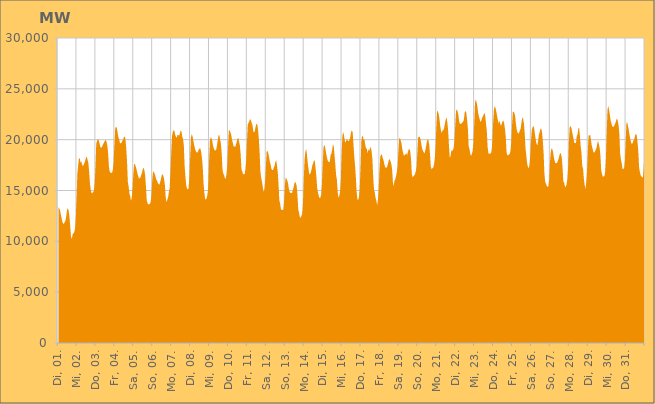
| Category | Series 0 |
|---|---|
|  Di, 01.  | 13354.942 |
|  Di, 01.  | 13255.334 |
|  Di, 01.  | 13085.168 |
|  Di, 01.  | 12667.159 |
|  Di, 01.  | 12308.351 |
|  Di, 01.  | 11910.334 |
|  Di, 01.  | 11761.243 |
|  Di, 01.  | 11702.961 |
|  Di, 01.  | 11907.739 |
|  Di, 01.  | 12050.575 |
|  Di, 01.  | 12500.394 |
|  Di, 01.  | 13094.295 |
|  Di, 01.  | 13257.323 |
|  Di, 01.  | 12997.577 |
|  Di, 01.  | 12395.051 |
|  Di, 01.  | 11457.394 |
|  Di, 01.  | 10455.026 |
|  Mi, 02.  | 10236.209 |
|  Mi, 02.  | 10668.967 |
|  Mi, 02.  | 10793.379 |
|  Mi, 02.  | 10877.033 |
|  Mi, 02.  | 11205.468 |
|  Mi, 02.  | 12221.2 |
|  Mi, 02.  | 14253.517 |
|  Mi, 02.  | 16600.066 |
|  Mi, 02.  | 17453.735 |
|  Mi, 02.  | 18122.37 |
|  Mi, 02.  | 18207.634 |
|  Mi, 02.  | 17735.587 |
|  Mi, 02.  | 17884.287 |
|  Mi, 02.  | 17563.233 |
|  Mi, 02.  | 17381.951 |
|  Mi, 02.  | 17521.274 |
|  Mi, 02.  | 17725.417 |
|  Mi, 02.  | 17936.06 |
|  Mi, 02.  | 18224.219 |
|  Mi, 02.  | 18333.295 |
|  Mi, 02.  | 18009.559 |
|  Mi, 02.  | 17681.701 |
|  Mi, 02.  | 16836.066 |
|  Mi, 02.  | 15659.605 |
|  Do, 03.  | 15081.889 |
|  Do, 03.  | 14766.886 |
|  Do, 03.  | 14720.924 |
|  Do, 03.  | 14861.775 |
|  Do, 03.  | 14964.348 |
|  Do, 03.  | 15733.579 |
|  Do, 03.  | 17422.314 |
|  Do, 03.  | 19612.31 |
|  Do, 03.  | 19873.034 |
|  Do, 03.  | 20060.047 |
|  Do, 03.  | 19966.723 |
|  Do, 03.  | 19661.201 |
|  Do, 03.  | 19327.11 |
|  Do, 03.  | 19196.018 |
|  Do, 03.  | 19262.035 |
|  Do, 03.  | 19435.202 |
|  Do, 03.  | 19585.532 |
|  Do, 03.  | 19746.894 |
|  Do, 03.  | 19927.138 |
|  Do, 03.  | 19953.826 |
|  Do, 03.  | 19810.943 |
|  Do, 03.  | 19414.29 |
|  Do, 03.  | 18715.01 |
|  Do, 03.  | 17374.387 |
|  Fr, 04.  | 16858.722 |
|  Fr, 04.  | 16770.253 |
|  Fr, 04.  | 16714.187 |
|  Fr, 04.  | 16743.367 |
|  Fr, 04.  | 17016.13 |
|  Fr, 04.  | 17798.197 |
|  Fr, 04.  | 19515.265 |
|  Fr, 04.  | 21102.726 |
|  Fr, 04.  | 21282.251 |
|  Fr, 04.  | 21173.187 |
|  Fr, 04.  | 20714.526 |
|  Fr, 04.  | 20246.556 |
|  Fr, 04.  | 20049.71 |
|  Fr, 04.  | 19676.047 |
|  Fr, 04.  | 19646.544 |
|  Fr, 04.  | 19702.779 |
|  Fr, 04.  | 19877.732 |
|  Fr, 04.  | 19986.54 |
|  Fr, 04.  | 20266.79 |
|  Fr, 04.  | 20317.382 |
|  Fr, 04.  | 20059.669 |
|  Fr, 04.  | 19179.881 |
|  Fr, 04.  | 17845.682 |
|  Fr, 04.  | 15863.469 |
|  Sa, 05.  | 15406.271 |
|  Sa, 05.  | 14694.874 |
|  Sa, 05.  | 14476 |
|  Sa, 05.  | 13974.287 |
|  Sa, 05.  | 14317.811 |
|  Sa, 05.  | 15228.001 |
|  Sa, 05.  | 16650.875 |
|  Sa, 05.  | 17604.982 |
|  Sa, 05.  | 17576.616 |
|  Sa, 05.  | 17366.655 |
|  Sa, 05.  | 17105.626 |
|  Sa, 05.  | 16731.113 |
|  Sa, 05.  | 16440.912 |
|  Sa, 05.  | 16196.126 |
|  Sa, 05.  | 16207.759 |
|  Sa, 05.  | 16279.315 |
|  Sa, 05.  | 16526.398 |
|  Sa, 05.  | 16757.109 |
|  Sa, 05.  | 17135.67 |
|  Sa, 05.  | 17230.867 |
|  Sa, 05.  | 16980.574 |
|  Sa, 05.  | 16476.74 |
|  Sa, 05.  | 15401.131 |
|  Sa, 05.  | 13990.11 |
|  So, 06.  | 13772.204 |
|  So, 06.  | 13620.147 |
|  So, 06.  | 13648.011 |
|  So, 06.  | 13685.431 |
|  So, 06.  | 13885.672 |
|  So, 06.  | 14694.059 |
|  So, 06.  | 16069.81 |
|  So, 06.  | 16921.941 |
|  So, 06.  | 16785.204 |
|  So, 06.  | 16644.705 |
|  So, 06.  | 16399.916 |
|  So, 06.  | 16083.039 |
|  So, 06.  | 15975.008 |
|  So, 06.  | 15731.023 |
|  So, 06.  | 15631.328 |
|  So, 06.  | 15557.524 |
|  So, 06.  | 15824.313 |
|  So, 06.  | 16150.886 |
|  So, 06.  | 16482.25 |
|  So, 06.  | 16624.98 |
|  So, 06.  | 16453.703 |
|  So, 06.  | 16080.432 |
|  So, 06.  | 15522.401 |
|  So, 06.  | 14319.252 |
|  Mo, 07.  | 13851.013 |
|  Mo, 07.  | 14081.675 |
|  Mo, 07.  | 14323.26 |
|  Mo, 07.  | 14808.672 |
|  Mo, 07.  | 15253.401 |
|  Mo, 07.  | 16786.041 |
|  Mo, 07.  | 18647.594 |
|  Mo, 07.  | 20354.482 |
|  Mo, 07.  | 20768.588 |
|  Mo, 07.  | 20889.341 |
|  Mo, 07.  | 20914.528 |
|  Mo, 07.  | 20488.119 |
|  Mo, 07.  | 20281.78 |
|  Mo, 07.  | 20177.09 |
|  Mo, 07.  | 20465.482 |
|  Mo, 07.  | 20458.541 |
|  Mo, 07.  | 20383.782 |
|  Mo, 07.  | 20618.094 |
|  Mo, 07.  | 20903.669 |
|  Mo, 07.  | 20791.934 |
|  Mo, 07.  | 20304.596 |
|  Mo, 07.  | 20070.818 |
|  Mo, 07.  | 19410.993 |
|  Mo, 07.  | 17432.6 |
|  Di, 08.  | 16361.87 |
|  Di, 08.  | 15512.951 |
|  Di, 08.  | 15192.785 |
|  Di, 08.  | 15120.469 |
|  Di, 08.  | 15202.624 |
|  Di, 08.  | 16338.879 |
|  Di, 08.  | 18245.575 |
|  Di, 08.  | 20177.354 |
|  Di, 08.  | 20543.986 |
|  Di, 08.  | 20342.825 |
|  Di, 08.  | 19911.809 |
|  Di, 08.  | 19499.813 |
|  Di, 08.  | 19154.34 |
|  Di, 08.  | 18891.583 |
|  Di, 08.  | 18778.071 |
|  Di, 08.  | 18710.398 |
|  Di, 08.  | 18841.456 |
|  Di, 08.  | 19047.866 |
|  Di, 08.  | 19116.204 |
|  Di, 08.  | 19135.545 |
|  Di, 08.  | 18755.93 |
|  Di, 08.  | 18183.594 |
|  Di, 08.  | 17234.791 |
|  Di, 08.  | 15658.018 |
|  Mi, 09.  | 14768.382 |
|  Mi, 09.  | 14157.095 |
|  Mi, 09.  | 14116.539 |
|  Mi, 09.  | 14278.907 |
|  Mi, 09.  | 14632.321 |
|  Mi, 09.  | 15549.401 |
|  Mi, 09.  | 17922.477 |
|  Mi, 09.  | 19847.795 |
|  Mi, 09.  | 20243.539 |
|  Mi, 09.  | 20133.044 |
|  Mi, 09.  | 19909.965 |
|  Mi, 09.  | 19397.581 |
|  Mi, 09.  | 19148.296 |
|  Mi, 09.  | 18947.074 |
|  Mi, 09.  | 18939.83 |
|  Mi, 09.  | 19013.006 |
|  Mi, 09.  | 19455.506 |
|  Mi, 09.  | 19958.577 |
|  Mi, 09.  | 20464.208 |
|  Mi, 09.  | 20412.83 |
|  Mi, 09.  | 19994.45 |
|  Mi, 09.  | 19596.249 |
|  Mi, 09.  | 18638.184 |
|  Mi, 09.  | 17044.579 |
|  Do, 10.  | 16653.28 |
|  Do, 10.  | 16518.499 |
|  Do, 10.  | 16220.275 |
|  Do, 10.  | 16159.207 |
|  Do, 10.  | 16571.906 |
|  Do, 10.  | 17431.813 |
|  Do, 10.  | 19216.003 |
|  Do, 10.  | 20866.287 |
|  Do, 10.  | 20940.914 |
|  Do, 10.  | 20714.252 |
|  Do, 10.  | 20486.64 |
|  Do, 10.  | 20007.517 |
|  Do, 10.  | 19710.299 |
|  Do, 10.  | 19353.346 |
|  Do, 10.  | 19334.448 |
|  Do, 10.  | 19285.082 |
|  Do, 10.  | 19490.705 |
|  Do, 10.  | 19784.56 |
|  Do, 10.  | 20111.173 |
|  Do, 10.  | 20186.095 |
|  Do, 10.  | 19837.175 |
|  Do, 10.  | 19434.953 |
|  Do, 10.  | 18577.329 |
|  Do, 10.  | 17116.88 |
|  Fr, 11.  | 16886.754 |
|  Fr, 11.  | 16618.396 |
|  Fr, 11.  | 16599.318 |
|  Fr, 11.  | 16590.314 |
|  Fr, 11.  | 17053.679 |
|  Fr, 11.  | 17923.774 |
|  Fr, 11.  | 19789.257 |
|  Fr, 11.  | 21500.815 |
|  Fr, 11.  | 21655.703 |
|  Fr, 11.  | 21832.807 |
|  Fr, 11.  | 22016.251 |
|  Fr, 11.  | 21920.495 |
|  Fr, 11.  | 21627.766 |
|  Fr, 11.  | 21428.838 |
|  Fr, 11.  | 20832.237 |
|  Fr, 11.  | 20705.671 |
|  Fr, 11.  | 20853.061 |
|  Fr, 11.  | 21309.192 |
|  Fr, 11.  | 21544.666 |
|  Fr, 11.  | 21522.048 |
|  Fr, 11.  | 21022.791 |
|  Fr, 11.  | 20129.771 |
|  Fr, 11.  | 18813.324 |
|  Fr, 11.  | 16896.597 |
|  Sa, 12.  | 16256.566 |
|  Sa, 12.  | 15868.625 |
|  Sa, 12.  | 15377.115 |
|  Sa, 12.  | 14858.972 |
|  Sa, 12.  | 15079.986 |
|  Sa, 12.  | 15854.824 |
|  Sa, 12.  | 17399.671 |
|  Sa, 12.  | 18859.35 |
|  Sa, 12.  | 18896.81 |
|  Sa, 12.  | 18679.972 |
|  Sa, 12.  | 18297.988 |
|  Sa, 12.  | 17831.98 |
|  Sa, 12.  | 17552.375 |
|  Sa, 12.  | 17111.216 |
|  Sa, 12.  | 17015.437 |
|  Sa, 12.  | 17014.085 |
|  Sa, 12.  | 17203.981 |
|  Sa, 12.  | 17445.793 |
|  Sa, 12.  | 17794.086 |
|  Sa, 12.  | 17980.99 |
|  Sa, 12.  | 17490.537 |
|  Sa, 12.  | 16823.358 |
|  Sa, 12.  | 15658.663 |
|  Sa, 12.  | 14044.857 |
|  So, 13.  | 13738.718 |
|  So, 13.  | 13198.55 |
|  So, 13.  | 13083.447 |
|  So, 13.  | 13092.687 |
|  So, 13.  | 13066.314 |
|  So, 13.  | 13846.013 |
|  So, 13.  | 15493.019 |
|  So, 13.  | 16253.389 |
|  So, 13.  | 16180.672 |
|  So, 13.  | 15985.59 |
|  So, 13.  | 15742.094 |
|  So, 13.  | 15217.654 |
|  So, 13.  | 14898.373 |
|  So, 13.  | 14753.297 |
|  So, 13.  | 14744.235 |
|  So, 13.  | 14743.35 |
|  So, 13.  | 15003.572 |
|  So, 13.  | 15274.52 |
|  So, 13.  | 15666.41 |
|  So, 13.  | 15862.089 |
|  So, 13.  | 15724.466 |
|  So, 13.  | 15443.816 |
|  So, 13.  | 14546.427 |
|  So, 13.  | 13140.915 |
|  Mo, 14.  | 12816.87 |
|  Mo, 14.  | 12381.041 |
|  Mo, 14.  | 12323.825 |
|  Mo, 14.  | 12503.047 |
|  Mo, 14.  | 12717.176 |
|  Mo, 14.  | 13816.972 |
|  Mo, 14.  | 16120.956 |
|  Mo, 14.  | 18035.014 |
|  Mo, 14.  | 18784.312 |
|  Mo, 14.  | 19096.89 |
|  Mo, 14.  | 18559.028 |
|  Mo, 14.  | 17732.45 |
|  Mo, 14.  | 17131.981 |
|  Mo, 14.  | 16575.37 |
|  Mo, 14.  | 16638.939 |
|  Mo, 14.  | 16785.843 |
|  Mo, 14.  | 17129.17 |
|  Mo, 14.  | 17511.612 |
|  Mo, 14.  | 17715.936 |
|  Mo, 14.  | 17966.829 |
|  Mo, 14.  | 17915.639 |
|  Mo, 14.  | 17166.717 |
|  Mo, 14.  | 16347.01 |
|  Mo, 14.  | 15221.035 |
|  Di, 15.  | 14810.079 |
|  Di, 15.  | 14459.067 |
|  Di, 15.  | 14261.262 |
|  Di, 15.  | 14285.528 |
|  Di, 15.  | 14572.644 |
|  Di, 15.  | 15590.091 |
|  Di, 15.  | 17542.029 |
|  Di, 15.  | 19234.926 |
|  Di, 15.  | 19489.248 |
|  Di, 15.  | 19285.262 |
|  Di, 15.  | 18823.032 |
|  Di, 15.  | 18388.016 |
|  Di, 15.  | 18025.716 |
|  Di, 15.  | 17835.616 |
|  Di, 15.  | 17803.424 |
|  Di, 15.  | 17808.785 |
|  Di, 15.  | 18505.606 |
|  Di, 15.  | 18611.955 |
|  Di, 15.  | 19000.737 |
|  Di, 15.  | 19555.889 |
|  Di, 15.  | 19342.259 |
|  Di, 15.  | 18457.014 |
|  Di, 15.  | 17542.352 |
|  Di, 15.  | 16504.162 |
|  Mi, 16.  | 16038.788 |
|  Mi, 16.  | 14828.54 |
|  Mi, 16.  | 14281.494 |
|  Mi, 16.  | 14474.631 |
|  Mi, 16.  | 14884.685 |
|  Mi, 16.  | 16086.818 |
|  Mi, 16.  | 18602.672 |
|  Mi, 16.  | 20393.024 |
|  Mi, 16.  | 20757.959 |
|  Mi, 16.  | 20420.73 |
|  Mi, 16.  | 19896.232 |
|  Mi, 16.  | 19708.006 |
|  Mi, 16.  | 19955.09 |
|  Mi, 16.  | 20074.252 |
|  Mi, 16.  | 19854.579 |
|  Mi, 16.  | 19879.725 |
|  Mi, 16.  | 20005.157 |
|  Mi, 16.  | 20279.447 |
|  Mi, 16.  | 20743.551 |
|  Mi, 16.  | 20919.711 |
|  Mi, 16.  | 20707.19 |
|  Mi, 16.  | 19516.832 |
|  Mi, 16.  | 18388.518 |
|  Mi, 16.  | 17462.977 |
|  Do, 17.  | 16322.719 |
|  Do, 17.  | 14870.582 |
|  Do, 17.  | 14139.801 |
|  Do, 17.  | 14070.989 |
|  Do, 17.  | 14387.873 |
|  Do, 17.  | 15316.145 |
|  Do, 17.  | 17309.193 |
|  Do, 17.  | 19853.09 |
|  Do, 17.  | 20348.45 |
|  Do, 17.  | 20319.192 |
|  Do, 17.  | 19960.681 |
|  Do, 17.  | 20016.646 |
|  Do, 17.  | 19437.865 |
|  Do, 17.  | 19166.023 |
|  Do, 17.  | 19070.089 |
|  Do, 17.  | 18667.715 |
|  Do, 17.  | 19049.442 |
|  Do, 17.  | 18919.629 |
|  Do, 17.  | 19146.927 |
|  Do, 17.  | 19296.356 |
|  Do, 17.  | 18820.529 |
|  Do, 17.  | 18065.326 |
|  Do, 17.  | 16342.646 |
|  Do, 17.  | 15119.514 |
|  Fr, 18.  | 14796.263 |
|  Fr, 18.  | 14275.956 |
|  Fr, 18.  | 14009.583 |
|  Fr, 18.  | 13547.869 |
|  Fr, 18.  | 14092.811 |
|  Fr, 18.  | 15233.334 |
|  Fr, 18.  | 17072.671 |
|  Fr, 18.  | 18366.769 |
|  Fr, 18.  | 18485.242 |
|  Fr, 18.  | 18575.801 |
|  Fr, 18.  | 18196.571 |
|  Fr, 18.  | 17999.157 |
|  Fr, 18.  | 17613.487 |
|  Fr, 18.  | 17329.739 |
|  Fr, 18.  | 17247.749 |
|  Fr, 18.  | 17243.096 |
|  Fr, 18.  | 17419.698 |
|  Fr, 18.  | 17718.484 |
|  Fr, 18.  | 18040.858 |
|  Fr, 18.  | 18068.879 |
|  Fr, 18.  | 17843.481 |
|  Fr, 18.  | 17603.234 |
|  Fr, 18.  | 17047.755 |
|  Fr, 18.  | 15819.155 |
|  Sa, 19.  | 15411.293 |
|  Sa, 19.  | 15983.709 |
|  Sa, 19.  | 16094.21 |
|  Sa, 19.  | 16441.671 |
|  Sa, 19.  | 16835.933 |
|  Sa, 19.  | 17458.629 |
|  Sa, 19.  | 18933.215 |
|  Sa, 19.  | 20144.396 |
|  Sa, 19.  | 20139.027 |
|  Sa, 19.  | 19886.453 |
|  Sa, 19.  | 19575.982 |
|  Sa, 19.  | 19002.016 |
|  Sa, 19.  | 18683.939 |
|  Sa, 19.  | 18400.31 |
|  Sa, 19.  | 18517.587 |
|  Sa, 19.  | 18555.737 |
|  Sa, 19.  | 18673.623 |
|  Sa, 19.  | 18471.168 |
|  Sa, 19.  | 18791.998 |
|  Sa, 19.  | 19019.099 |
|  Sa, 19.  | 19091.325 |
|  Sa, 19.  | 18849.818 |
|  Sa, 19.  | 18036.225 |
|  Sa, 19.  | 16603.884 |
|  So, 20.  | 16288.402 |
|  So, 20.  | 16402.144 |
|  So, 20.  | 16474.147 |
|  So, 20.  | 16630.254 |
|  So, 20.  | 16874.403 |
|  So, 20.  | 17324.67 |
|  So, 20.  | 18779.129 |
|  So, 20.  | 20248.816 |
|  So, 20.  | 20287.968 |
|  So, 20.  | 20287.098 |
|  So, 20.  | 20055.624 |
|  So, 20.  | 19562.755 |
|  So, 20.  | 19139.747 |
|  So, 20.  | 18900.06 |
|  So, 20.  | 18753.786 |
|  So, 20.  | 18641.382 |
|  So, 20.  | 18933.779 |
|  So, 20.  | 19336.099 |
|  So, 20.  | 19811.213 |
|  So, 20.  | 20049.862 |
|  So, 20.  | 19946.911 |
|  So, 20.  | 19519.825 |
|  So, 20.  | 18560.918 |
|  So, 20.  | 17341.899 |
|  Mo, 21.  | 17097.112 |
|  Mo, 21.  | 17177.357 |
|  Mo, 21.  | 17232.311 |
|  Mo, 21.  | 17511.256 |
|  Mo, 21.  | 18091.903 |
|  Mo, 21.  | 19234.206 |
|  Mo, 21.  | 21190.689 |
|  Mo, 21.  | 22858.176 |
|  Mo, 21.  | 22734.812 |
|  Mo, 21.  | 22542.409 |
|  Mo, 21.  | 22015.89 |
|  Mo, 21.  | 21324.752 |
|  Mo, 21.  | 20868.093 |
|  Mo, 21.  | 20662.21 |
|  Mo, 21.  | 20941.574 |
|  Mo, 21.  | 20931.681 |
|  Mo, 21.  | 21187.268 |
|  Mo, 21.  | 21636.702 |
|  Mo, 21.  | 21994.034 |
|  Mo, 21.  | 22204.415 |
|  Mo, 21.  | 21699.182 |
|  Mo, 21.  | 20889.428 |
|  Mo, 21.  | 19472.986 |
|  Mo, 21.  | 18213.568 |
|  Di, 22.  | 18360.582 |
|  Di, 22.  | 18926.388 |
|  Di, 22.  | 18930.666 |
|  Di, 22.  | 18950.468 |
|  Di, 22.  | 19207.779 |
|  Di, 22.  | 19938.705 |
|  Di, 22.  | 21456.29 |
|  Di, 22.  | 22789.34 |
|  Di, 22.  | 23000.677 |
|  Di, 22.  | 22782.924 |
|  Di, 22.  | 22403.522 |
|  Di, 22.  | 21784.453 |
|  Di, 22.  | 21535.43 |
|  Di, 22.  | 21563.352 |
|  Di, 22.  | 21591.86 |
|  Di, 22.  | 21702.63 |
|  Di, 22.  | 21771.055 |
|  Di, 22.  | 22002.275 |
|  Di, 22.  | 22691.115 |
|  Di, 22.  | 22833.863 |
|  Di, 22.  | 22659.045 |
|  Di, 22.  | 21953.179 |
|  Di, 22.  | 21084.301 |
|  Di, 22.  | 19365.063 |
|  Mi, 23.  | 19097.395 |
|  Mi, 23.  | 18611.352 |
|  Mi, 23.  | 18403.335 |
|  Mi, 23.  | 18586.928 |
|  Mi, 23.  | 18864.437 |
|  Mi, 23.  | 19676.258 |
|  Mi, 23.  | 21480.367 |
|  Mi, 23.  | 23564.513 |
|  Mi, 23.  | 23975.452 |
|  Mi, 23.  | 23685.566 |
|  Mi, 23.  | 23302.817 |
|  Mi, 23.  | 22640.768 |
|  Mi, 23.  | 22272.149 |
|  Mi, 23.  | 21993.935 |
|  Mi, 23.  | 21730.487 |
|  Mi, 23.  | 21867.383 |
|  Mi, 23.  | 22146.387 |
|  Mi, 23.  | 22270.148 |
|  Mi, 23.  | 22491.167 |
|  Mi, 23.  | 22625.786 |
|  Mi, 23.  | 22363.181 |
|  Mi, 23.  | 21568.929 |
|  Mi, 23.  | 20862.256 |
|  Mi, 23.  | 19299.182 |
|  Do, 24.  | 18658.437 |
|  Do, 24.  | 18587.91 |
|  Do, 24.  | 18660.545 |
|  Do, 24.  | 18615.806 |
|  Do, 24.  | 18888.584 |
|  Do, 24.  | 19834.522 |
|  Do, 24.  | 21634.697 |
|  Do, 24.  | 22919.935 |
|  Do, 24.  | 23306.716 |
|  Do, 24.  | 23140.557 |
|  Do, 24.  | 22781.37 |
|  Do, 24.  | 22359.739 |
|  Do, 24.  | 21907.624 |
|  Do, 24.  | 21591.019 |
|  Do, 24.  | 21891.853 |
|  Do, 24.  | 21579.407 |
|  Do, 24.  | 21325.843 |
|  Do, 24.  | 21604.149 |
|  Do, 24.  | 21814.955 |
|  Do, 24.  | 21868.321 |
|  Do, 24.  | 21592.278 |
|  Do, 24.  | 21059.407 |
|  Do, 24.  | 20298.863 |
|  Do, 24.  | 18785.087 |
|  Fr, 25.  | 18449.971 |
|  Fr, 25.  | 18488.107 |
|  Fr, 25.  | 18513.336 |
|  Fr, 25.  | 18595.884 |
|  Fr, 25.  | 18901.912 |
|  Fr, 25.  | 19772.803 |
|  Fr, 25.  | 21433.406 |
|  Fr, 25.  | 22716.103 |
|  Fr, 25.  | 22766.498 |
|  Fr, 25.  | 22617.372 |
|  Fr, 25.  | 22274.064 |
|  Fr, 25.  | 21464.81 |
|  Fr, 25.  | 20951.807 |
|  Fr, 25.  | 20689.935 |
|  Fr, 25.  | 20587.855 |
|  Fr, 25.  | 20705.607 |
|  Fr, 25.  | 20909.585 |
|  Fr, 25.  | 21100.415 |
|  Fr, 25.  | 21739.28 |
|  Fr, 25.  | 22189.273 |
|  Fr, 25.  | 22069.703 |
|  Fr, 25.  | 21619.795 |
|  Fr, 25.  | 20672.284 |
|  Fr, 25.  | 19206.327 |
|  Sa, 26.  | 18491.563 |
|  Sa, 26.  | 17722.329 |
|  Sa, 26.  | 17356.119 |
|  Sa, 26.  | 17177.482 |
|  Sa, 26.  | 17468.487 |
|  Sa, 26.  | 18335.734 |
|  Sa, 26.  | 19850.432 |
|  Sa, 26.  | 20909.892 |
|  Sa, 26.  | 21236.163 |
|  Sa, 26.  | 21340.402 |
|  Sa, 26.  | 21120.719 |
|  Sa, 26.  | 20530.883 |
|  Sa, 26.  | 20021.611 |
|  Sa, 26.  | 19601.882 |
|  Sa, 26.  | 19420.496 |
|  Sa, 26.  | 19899.526 |
|  Sa, 26.  | 20492.367 |
|  Sa, 26.  | 20737.513 |
|  Sa, 26.  | 21049.491 |
|  Sa, 26.  | 21080.091 |
|  Sa, 26.  | 20720.514 |
|  Sa, 26.  | 19873.917 |
|  Sa, 26.  | 18685.12 |
|  Sa, 26.  | 16693.166 |
|  So, 27.  | 15850.218 |
|  So, 27.  | 15671.969 |
|  So, 27.  | 15465.968 |
|  So, 27.  | 15355.583 |
|  So, 27.  | 15390.25 |
|  So, 27.  | 16052.868 |
|  So, 27.  | 17740.035 |
|  So, 27.  | 18751.518 |
|  So, 27.  | 19144.317 |
|  So, 27.  | 19060.795 |
|  So, 27.  | 18775.175 |
|  So, 27.  | 18235.148 |
|  So, 27.  | 17914.22 |
|  So, 27.  | 17668.674 |
|  So, 27.  | 17698.455 |
|  So, 27.  | 17704.967 |
|  So, 27.  | 17920.424 |
|  So, 27.  | 18137.783 |
|  So, 27.  | 18450.45 |
|  So, 27.  | 18712.27 |
|  So, 27.  | 18580.287 |
|  So, 27.  | 18265.01 |
|  So, 27.  | 17282.688 |
|  So, 27.  | 15912.636 |
|  Mo, 28.  | 15761.895 |
|  Mo, 28.  | 15413.445 |
|  Mo, 28.  | 15323.191 |
|  Mo, 28.  | 15576.166 |
|  Mo, 28.  | 16047.468 |
|  Mo, 28.  | 17222.148 |
|  Mo, 28.  | 19770.363 |
|  Mo, 28.  | 21189.555 |
|  Mo, 28.  | 21348.613 |
|  Mo, 28.  | 21208.774 |
|  Mo, 28.  | 20841.606 |
|  Mo, 28.  | 20440.965 |
|  Mo, 28.  | 20036.386 |
|  Mo, 28.  | 19669.946 |
|  Mo, 28.  | 19665.3 |
|  Mo, 28.  | 19658.551 |
|  Mo, 28.  | 20359.159 |
|  Mo, 28.  | 20501.731 |
|  Mo, 28.  | 21105.663 |
|  Mo, 28.  | 21146.894 |
|  Mo, 28.  | 20373.153 |
|  Mo, 28.  | 19349.258 |
|  Mo, 28.  | 18736.234 |
|  Mo, 28.  | 17380.144 |
|  Di, 29.  | 17161.746 |
|  Di, 29.  | 16147.408 |
|  Di, 29.  | 15558.954 |
|  Di, 29.  | 15138.073 |
|  Di, 29.  | 15778.749 |
|  Di, 29.  | 16869.105 |
|  Di, 29.  | 18801.547 |
|  Di, 29.  | 20396.736 |
|  Di, 29.  | 20419.906 |
|  Di, 29.  | 20469.393 |
|  Di, 29.  | 19974.017 |
|  Di, 29.  | 19426.651 |
|  Di, 29.  | 19118.288 |
|  Di, 29.  | 18777.367 |
|  Di, 29.  | 18731.239 |
|  Di, 29.  | 18808.171 |
|  Di, 29.  | 19004.642 |
|  Di, 29.  | 19172.614 |
|  Di, 29.  | 19601.21 |
|  Di, 29.  | 19892.545 |
|  Di, 29.  | 19553.164 |
|  Di, 29.  | 19190.429 |
|  Di, 29.  | 18426.44 |
|  Di, 29.  | 16971.492 |
|  Mi, 30.  | 16657.976 |
|  Mi, 30.  | 16341.486 |
|  Mi, 30.  | 16388.794 |
|  Mi, 30.  | 16424.421 |
|  Mi, 30.  | 16810.308 |
|  Mi, 30.  | 18160.565 |
|  Mi, 30.  | 20874.214 |
|  Mi, 30.  | 22954.134 |
|  Mi, 30.  | 23322.397 |
|  Mi, 30.  | 22905.493 |
|  Mi, 30.  | 22417.673 |
|  Mi, 30.  | 21869.841 |
|  Mi, 30.  | 21587.391 |
|  Mi, 30.  | 21295.462 |
|  Mi, 30.  | 21278.716 |
|  Mi, 30.  | 21272.666 |
|  Mi, 30.  | 21466.759 |
|  Mi, 30.  | 21641.826 |
|  Mi, 30.  | 21912.491 |
|  Mi, 30.  | 22076.32 |
|  Mi, 30.  | 21837.151 |
|  Mi, 30.  | 21406.984 |
|  Mi, 30.  | 20606.738 |
|  Mi, 30.  | 18627.704 |
|  Do, 31.  | 18043.525 |
|  Do, 31.  | 17671.229 |
|  Do, 31.  | 17080.351 |
|  Do, 31.  | 17146.796 |
|  Do, 31.  | 17170.888 |
|  Do, 31.  | 17931.994 |
|  Do, 31.  | 19861.504 |
|  Do, 31.  | 21643.771 |
|  Do, 31.  | 21686.448 |
|  Do, 31.  | 21328.321 |
|  Do, 31.  | 20919.489 |
|  Do, 31.  | 20413.946 |
|  Do, 31.  | 20007.095 |
|  Do, 31.  | 19706.539 |
|  Do, 31.  | 19532.302 |
|  Do, 31.  | 19742.194 |
|  Do, 31.  | 19918.081 |
|  Do, 31.  | 20060.536 |
|  Do, 31.  | 20443.026 |
|  Do, 31.  | 20559.735 |
|  Do, 31.  | 20408.944 |
|  Do, 31.  | 19782.351 |
|  Do, 31.  | 18860.589 |
|  Do, 31.  | 17310.368 |
|  Fr, 01.  | 16820.132 |
|  Fr, 01.  | 16479.439 |
|  Fr, 01.  | 16398.854 |
|  Fr, 01.  | 16271.921 |
|  Fr, 01.  | 16354.334 |
|  Fr, 01.  | 17347.982 |